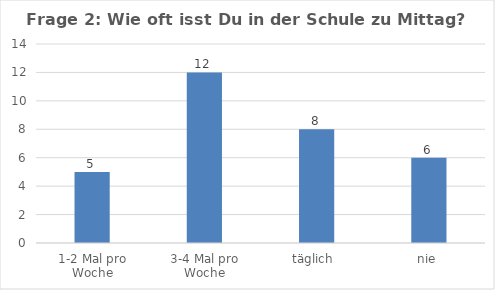
| Category | Series 0 |
|---|---|
| 1-2 Mal pro Woche | 5 |
| 3-4 Mal pro Woche | 12 |
| täglich  | 8 |
| nie | 6 |